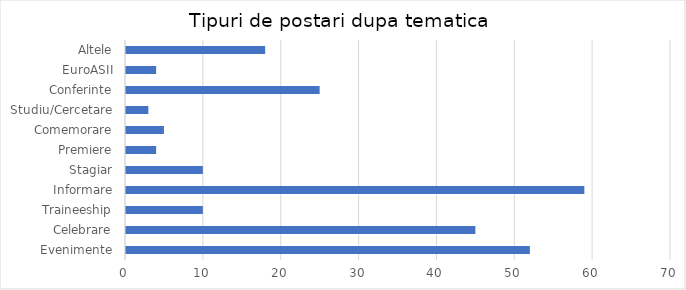
| Category | Series 0 |
|---|---|
| Evenimente | 52 |
| Celebrare | 45 |
| Traineeship | 10 |
| Informare | 59 |
| Stagiar | 10 |
| Premiere | 4 |
| Comemorare | 5 |
| Studiu/Cercetare | 3 |
| Conferinte | 25 |
| EuroASII | 4 |
| Altele | 18 |